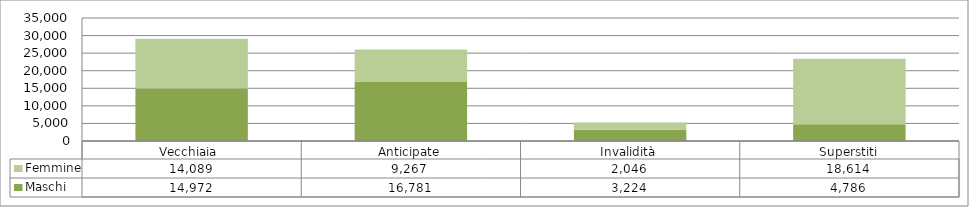
| Category | Maschi | Femmine |
|---|---|---|
| Vecchiaia  | 14972 | 14089 |
| Anticipate | 16781 | 9267 |
| Invalidità | 3224 | 2046 |
| Superstiti | 4786 | 18614 |